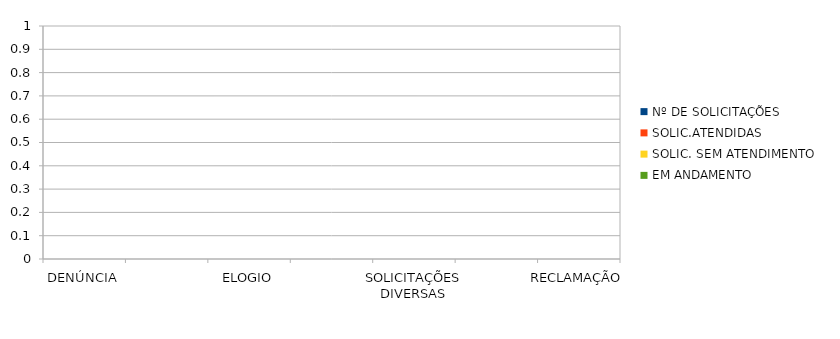
| Category | Nº DE SOLICITAÇÕES | SOLIC.ATENDIDAS | SOLIC. SEM ATENDIMENTO | EM ANDAMENTO |
|---|---|---|---|---|
| DENÚNCIA | 0 | 0 | 0 | 0 |
| DÚVIDA | 0 | 0 | 0 | 0 |
| ELOGIO | 0 | 0 | 0 | 0 |
| PEDIDO DE ACESSO À INFORMAÇÃO | 0 | 0 | 0 | 0 |
| SOLICITAÇÕES DIVERSAS | 0 | 0 | 0 | 0 |
| SUGESTÃO  | 0 | 0 | 0 | 0 |
| RECLAMAÇÃO | 0 | 0 | 0 | 0 |